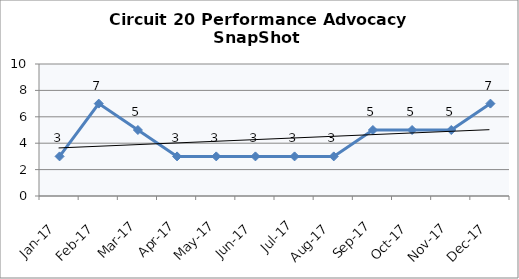
| Category | Circuit 20 |
|---|---|
| Jan-17 | 3 |
| Feb-17 | 7 |
| Mar-17 | 5 |
| Apr-17 | 3 |
| May-17 | 3 |
| Jun-17 | 3 |
| Jul-17 | 3 |
| Aug-17 | 3 |
| Sep-17 | 5 |
| Oct-17 | 5 |
| Nov-17 | 5 |
| Dec-17 | 7 |